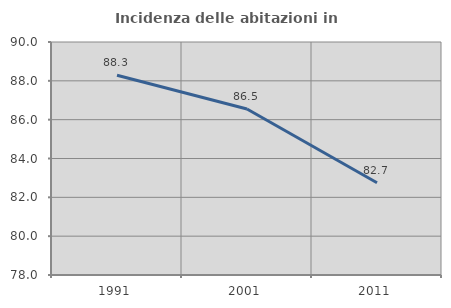
| Category | Incidenza delle abitazioni in proprietà  |
|---|---|
| 1991.0 | 88.291 |
| 2001.0 | 86.55 |
| 2011.0 | 82.749 |